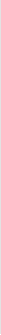
| Category | Series 0 | Series 1 | Series 2 | Series 3 | Series 4 | Series 5 | Series 6 | Series 7 |
|---|---|---|---|---|---|---|---|---|
| 0 | 1 | 1 | 1 | 1 | 1 | 1 | 1 | 1 |